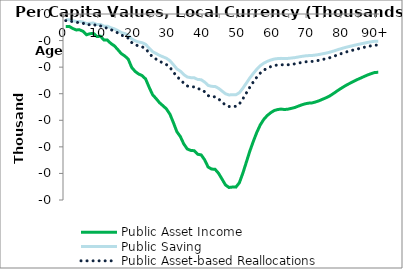
| Category | Public Asset Income | Public Saving | Public Asset-based Reallocations |
|---|---|---|---|
| 0 | -23.452 | -10.943 | -12.509 |
|  | -23.292 | -10.868 | -12.424 |
| 2 | -27.223 | -12.702 | -14.52 |
| 3 | -29.915 | -13.959 | -15.957 |
| 4 | -29.792 | -13.901 | -15.891 |
| 5 | -32.631 | -15.226 | -17.405 |
| 6 | -39.021 | -18.207 | -20.814 |
| 7 | -37.038 | -17.282 | -19.756 |
| 8 | -36.563 | -17.06 | -19.502 |
| 9 | -42.492 | -19.827 | -22.665 |
| 10 | -41.803 | -19.506 | -22.298 |
| 11 | -48.949 | -22.84 | -26.109 |
| 12 | -49.06 | -22.891 | -26.168 |
| 13 | -55.49 | -25.892 | -29.598 |
| 14 | -59.849 | -27.926 | -31.923 |
| 15 | -67.055 | -31.288 | -35.767 |
| 16 | -74.576 | -34.798 | -39.778 |
| 17 | -78.944 | -36.836 | -42.108 |
| 18 | -85.042 | -39.681 | -45.361 |
| 19 | -100.643 | -46.961 | -53.683 |
| 20 | -108.098 | -50.439 | -57.659 |
| 21 | -112.941 | -52.699 | -60.242 |
| 22 | -115.845 | -54.054 | -61.791 |
| 23 | -122.245 | -57.04 | -65.205 |
| 24 | -137.58 | -64.196 | -73.385 |
| 25 | -151.767 | -70.815 | -80.952 |
| 26 | -159.049 | -74.213 | -84.836 |
| 27 | -166.894 | -77.874 | -89.021 |
| 28 | -172.641 | -80.555 | -92.086 |
| 29 | -178.626 | -83.348 | -95.279 |
| 30 | -188.431 | -87.923 | -100.508 |
| 31 | -204.381 | -95.365 | -109.016 |
| 32 | -221.437 | -103.323 | -118.113 |
| 33 | -230.609 | -107.603 | -123.006 |
| 34 | -244.56 | -114.113 | -130.447 |
| 35 | -254.048 | -118.54 | -135.508 |
| 36 | -256.66 | -119.759 | -136.901 |
| 37 | -257.27 | -120.043 | -137.227 |
| 38 | -263.94 | -123.156 | -140.784 |
| 39 | -265.094 | -123.694 | -141.4 |
| 40 | -274.336 | -128.007 | -146.33 |
| 41 | -287.942 | -134.355 | -153.587 |
| 42 | -291.777 | -136.144 | -155.632 |
| 43 | -292.19 | -136.337 | -155.853 |
| 44 | -299.656 | -139.821 | -159.835 |
| 45 | -310.597 | -144.926 | -165.671 |
| 46 | -321.628 | -150.073 | -171.555 |
| 47 | -326.414 | -152.306 | -174.108 |
| 48 | -325.645 | -151.947 | -173.697 |
| 49 | -325.772 | -152.007 | -173.765 |
| 50 | -317.542 | -148.167 | -169.376 |
| 51 | -299.536 | -139.765 | -159.771 |
| 52 | -279.049 | -130.205 | -148.843 |
| 53 | -258.335 | -120.54 | -137.794 |
| 54 | -240.003 | -111.987 | -128.017 |
| 55 | -223.118 | -104.108 | -119.01 |
| 56 | -208.927 | -97.486 | -111.441 |
| 57 | -198.537 | -92.639 | -105.899 |
| 58 | -191.261 | -89.244 | -102.018 |
| 59 | -185.886 | -86.735 | -99.151 |
| 60 | -181.729 | -84.796 | -96.934 |
| 61 | -179.855 | -83.921 | -95.934 |
| 62 | -178.907 | -83.479 | -95.428 |
| 63 | -179.744 | -83.87 | -95.875 |
| 64 | -179.04 | -83.541 | -95.499 |
| 65 | -177.542 | -82.842 | -94.7 |
| 66 | -175.891 | -82.072 | -93.819 |
| 67 | -173.299 | -80.862 | -92.437 |
| 68 | -170.917 | -79.751 | -91.166 |
| 69 | -168.882 | -78.801 | -90.081 |
| 70 | -167.732 | -78.265 | -89.468 |
| 71 | -167.215 | -78.023 | -89.192 |
| 72 | -165.43 | -77.191 | -88.24 |
| 73 | -163.155 | -76.129 | -87.026 |
| 74 | -160.288 | -74.791 | -85.497 |
| 75 | -157.563 | -73.52 | -84.043 |
| 76 | -154.254 | -71.975 | -82.278 |
| 77 | -150.046 | -70.012 | -80.034 |
| 78 | -145.544 | -67.912 | -77.633 |
| 79 | -141.127 | -65.85 | -75.276 |
| 80 | -137.036 | -63.942 | -73.094 |
| 81 | -133.183 | -62.144 | -71.039 |
| 82 | -129.829 | -60.579 | -69.25 |
| 83 | -126.511 | -59.03 | -67.48 |
| 84 | -123.291 | -57.528 | -65.763 |
| 85 | -120.338 | -56.15 | -64.188 |
| 86 | -117.398 | -54.778 | -62.619 |
| 87 | -114.536 | -53.443 | -61.093 |
| 88 | -112.15 | -52.33 | -59.82 |
| 89 | -109.941 | -51.299 | -58.642 |
| 90+ | -109.781 | -51.224 | -58.557 |